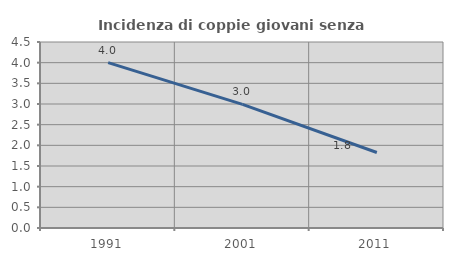
| Category | Incidenza di coppie giovani senza figli |
|---|---|
| 1991.0 | 4 |
| 2001.0 | 2.991 |
| 2011.0 | 1.827 |